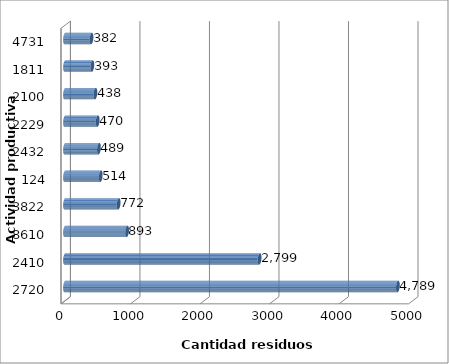
| Category | Series 0 |
|---|---|
| 2720.0 | 4788.825 |
| 2410.0 | 2799.374 |
| 8610.0 | 893.346 |
| 3822.0 | 771.589 |
| 124.0 | 514.132 |
| 2432.0 | 488.697 |
| 2229.0 | 469.807 |
| 2100.0 | 437.748 |
| 1811.0 | 392.999 |
| 4731.0 | 381.52 |